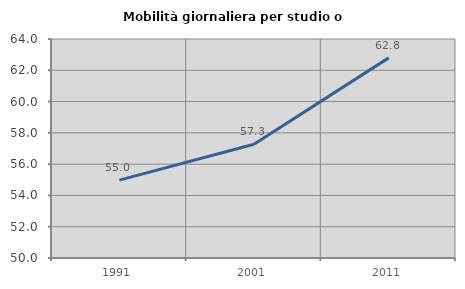
| Category | Mobilità giornaliera per studio o lavoro |
|---|---|
| 1991.0 | 54.98 |
| 2001.0 | 57.275 |
| 2011.0 | 62.794 |